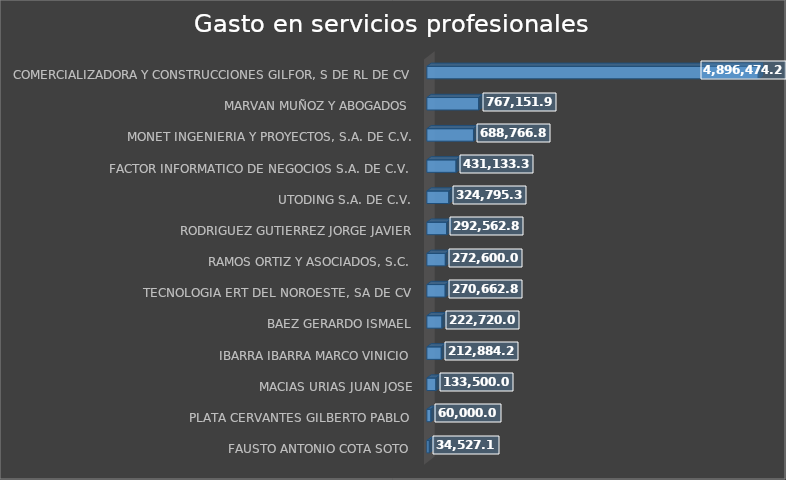
| Category | Suma |
|---|---|
| FAUSTO ANTONIO COTA SOTO | 34527.13 |
| PLATA CERVANTES GILBERTO PABLO | 60000 |
| MACIAS URIAS JUAN JOSE | 133500 |
| IBARRA IBARRA MARCO VINICIO | 212884.2 |
| BAEZ GERARDO ISMAEL | 222720 |
| TECNOLOGIA ERT DEL NOROESTE, SA DE CV | 270662.8 |
| RAMOS ORTIZ Y ASOCIADOS, S.C. | 272600 |
| RODRIGUEZ GUTIERREZ JORGE JAVIER | 292562.88 |
| UTODING S.A. DE C.V. | 324795.36 |
| FACTOR INFORMATICO DE NEGOCIOS S.A. DE C.V. | 431133.33 |
| MONET INGENIERIA Y PROYECTOS, S.A. DE C.V. | 688766.8 |
| MARVAN MUÑOZ Y ABOGADOS | 767151.91 |
| COMERCIALIZADORA Y CONSTRUCCIONES GILFOR, S DE RL DE CV | 4896474.25 |